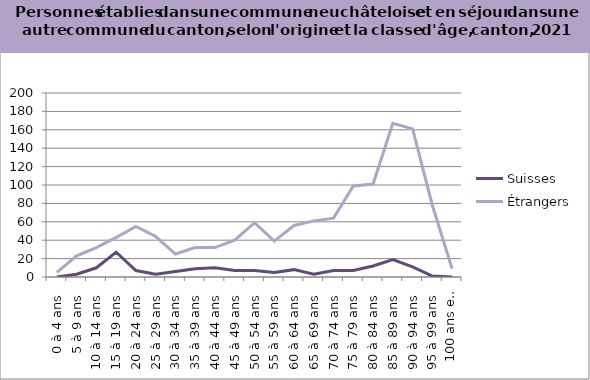
| Category | Suisses | Étrangers |
|---|---|---|
| 0 à 4 ans | 0 | 5 |
| 5 à 9 ans | 3 | 23 |
| 10 à 14 ans | 10 | 32 |
| 15 à 19 ans | 27 | 43 |
| 20 à 24 ans | 7 | 55 |
| 25 à 29 ans | 3 | 44 |
| 30 à 34 ans | 6 | 25 |
| 35 à 39 ans | 9 | 32 |
| 40 à 44 ans | 10 | 32 |
| 45 à 49 ans | 7 | 40 |
| 50 à 54 ans | 7 | 59 |
| 55 à 59 ans | 5 | 39 |
| 60 à 64 ans | 8 | 56 |
| 65 à 69 ans | 3 | 61 |
| 70 à 74 ans | 7 | 64 |
| 75 à 79 ans | 7 | 99 |
| 80 à 84 ans | 12 | 101 |
| 85 à 89 ans | 19 | 167 |
| 90 à 94 ans | 11 | 161 |
| 95 à 99 ans | 1 | 78 |
| 100 ans et plus | 0 | 9 |